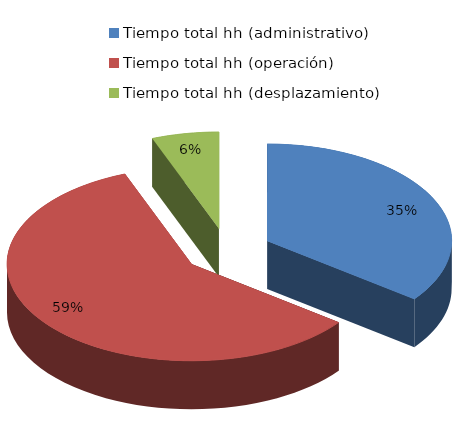
| Category | Series 0 |
|---|---|
| Tiempo total hh (administrativo) | 0.353 |
| Tiempo total hh (operación) | 0.588 |
| Tiempo total hh (desplazamiento) | 0.059 |